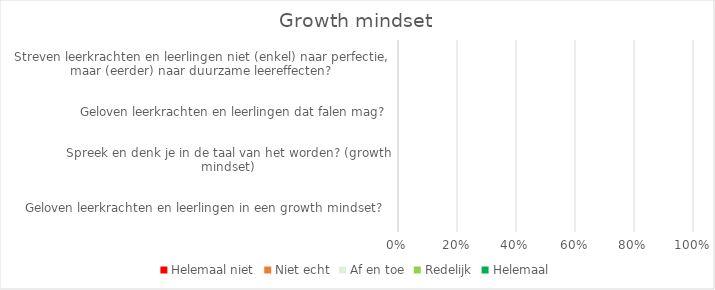
| Category | Helemaal niet | Niet echt | Af en toe | Redelijk | Helemaal |
|---|---|---|---|---|---|
| Geloven leerkrachten en leerlingen in een growth mindset?  | 0 | 0 | 0 | 0 | 0 |
| Spreek en denk je in de taal van het worden? (growth mindset) | 0 | 0 | 0 | 0 | 0 |
| Geloven leerkrachten en leerlingen dat falen mag? | 0 | 0 | 0 | 0 | 0 |
| Streven leerkrachten en leerlingen niet (enkel) naar perfectie, maar (eerder) naar duurzame leereffecten? | 0 | 0 | 0 | 0 | 0 |